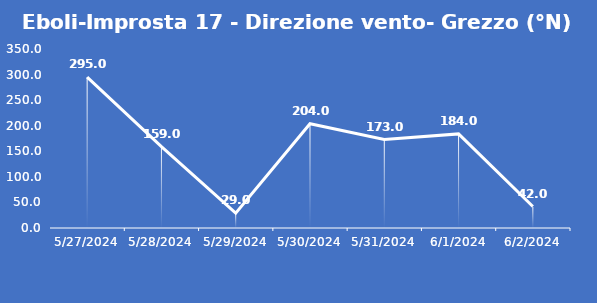
| Category | Eboli-Improsta 17 - Direzione vento- Grezzo (°N) |
|---|---|
| 5/27/24 | 295 |
| 5/28/24 | 159 |
| 5/29/24 | 29 |
| 5/30/24 | 204 |
| 5/31/24 | 173 |
| 6/1/24 | 184 |
| 6/2/24 | 42 |